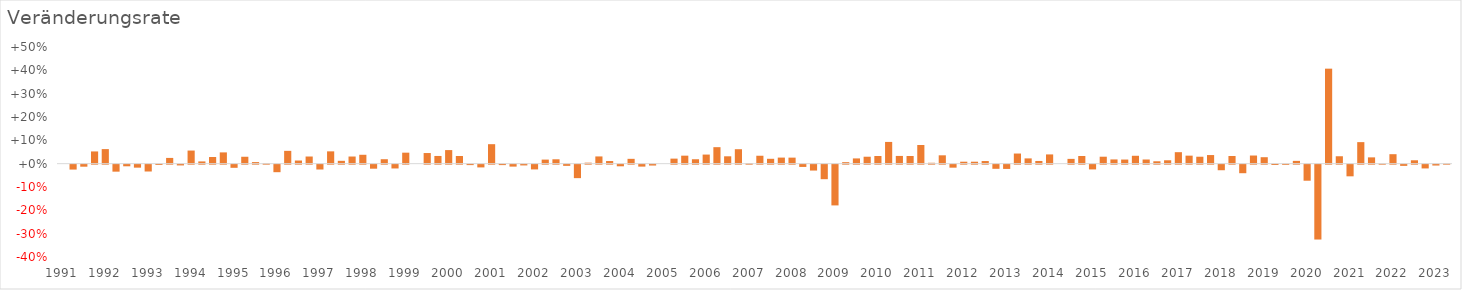
| Category | Veränderungsrate |
|---|---|
| 1991.0 | 0 |
| nan | -2.1 |
| nan | -0.87 |
| nan | 5.241 |
| 1992.0 | 6.243 |
| nan | -2.997 |
| nan | -0.695 |
| nan | -1.282 |
| 1993.0 | -2.929 |
| nan | -0.108 |
| nan | 2.465 |
| nan | -0.323 |
| 1994.0 | 5.622 |
| nan | 0.962 |
| nan | 2.846 |
| nan | 4.833 |
| 1995.0 | -1.349 |
| nan | 2.962 |
| nan | 0.677 |
| nan | 0.208 |
| 1996.0 | -3.225 |
| nan | 5.491 |
| nan | 1.347 |
| nan | 3.066 |
| 1997.0 | -2.074 |
| nan | 5.279 |
| nan | 1.22 |
| nan | 3.062 |
| 1998.0 | 3.809 |
| nan | -1.725 |
| nan | 1.907 |
| nan | -1.626 |
| 1999.0 | 4.712 |
| nan | 0 |
| nan | 4.555 |
| nan | 3.302 |
| 2000.0 | 5.821 |
| nan | 3.277 |
| nan | -0.189 |
| nan | -1.176 |
| 2001.0 | 8.353 |
| nan | -0.186 |
| nan | -0.834 |
| nan | -0.326 |
| 2002.0 | -2.035 |
| nan | 1.745 |
| nan | 1.879 |
| nan | -0.51 |
| 2003.0 | -5.774 |
| nan | 0.425 |
| nan | 3.099 |
| nan | 1.127 |
| 2004.0 | -0.698 |
| nan | 2.072 |
| nan | -0.834 |
| nan | -0.372 |
| 2005.0 | 0 |
| nan | 2.162 |
| nan | 3.429 |
| nan | 1.899 |
| 2006.0 | 3.901 |
| nan | 7.071 |
| nan | 3.156 |
| nan | 6.198 |
| 2007.0 | 0.262 |
| nan | 3.395 |
| nan | 2.088 |
| nan | 2.602 |
| 2008.0 | 2.585 |
| nan | -0.972 |
| nan | -2.526 |
| nan | -6.224 |
| 2009.0 | -17.461 |
| nan | 0.64 |
| nan | 2.25 |
| nan | 2.976 |
| 2010.0 | 3.276 |
| nan | 9.317 |
| nan | 3.311 |
| nan | 3.284 |
| 2011.0 | 7.996 |
| nan | 0.379 |
| nan | 3.579 |
| nan | -1.286 |
| 2012.0 | 0.839 |
| nan | 0.837 |
| nan | 1.129 |
| nan | -1.774 |
| 2013.0 | -1.823 |
| nan | 4.343 |
| nan | 2.258 |
| nan | 1.16 |
| 2014.0 | 3.963 |
| nan | 0 |
| nan | 2.051 |
| nan | 3.28 |
| 2015.0 | -2.034 |
| nan | 2.981 |
| nan | 1.817 |
| nan | 1.768 |
| 2016.0 | 3.38 |
| nan | 1.785 |
| nan | 1.024 |
| nan | 1.456 |
| 2017.0 | 4.924 |
| nan | 3.434 |
| nan | 2.975 |
| nan | 3.691 |
| 2018.0 | -2.384 |
| nan | 3.292 |
| nan | -3.662 |
| nan | 3.49 |
| 2019.0 | 2.769 |
| nan | -0.149 |
| nan | -0.075 |
| nan | 1.199 |
| 2020.0 | -6.881 |
| nan | -32.083 |
| nan | 40.716 |
| nan | 3.177 |
| 2021.0 | -4.995 |
| nan | 9.232 |
| nan | 2.7 |
| nan | 0.037 |
| 2022.0 | 4.061 |
| nan | -0.517 |
| nan | 1.454 |
| nan | -1.615 |
| 2023.0 | -0.37 |
| nan | 0.074 |